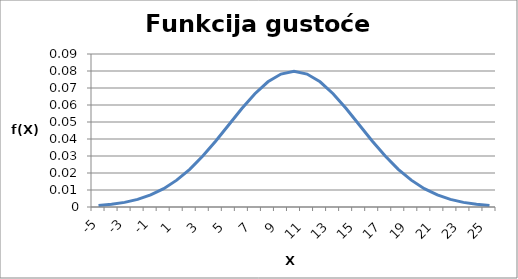
| Category | Series 0 |
|---|---|
| -5.0 | 0.001 |
| -4.0 | 0.002 |
| -3.0 | 0.003 |
| -2.0 | 0.004 |
| -1.0 | 0.007 |
| 0.0 | 0.011 |
| 1.0 | 0.016 |
| 2.0 | 0.022 |
| 3.0 | 0.03 |
| 4.0 | 0.039 |
| 5.0 | 0.048 |
| 6.0 | 0.058 |
| 7.0 | 0.067 |
| 8.0 | 0.074 |
| 9.0 | 0.078 |
| 10.0 | 0.08 |
| 11.0 | 0.078 |
| 12.0 | 0.074 |
| 13.0 | 0.067 |
| 14.0 | 0.058 |
| 15.0 | 0.048 |
| 16.0 | 0.039 |
| 17.0 | 0.03 |
| 18.0 | 0.022 |
| 19.0 | 0.016 |
| 20.0 | 0.011 |
| 21.0 | 0.007 |
| 22.0 | 0.004 |
| 23.0 | 0.003 |
| 24.0 | 0.002 |
| 25.0 | 0.001 |